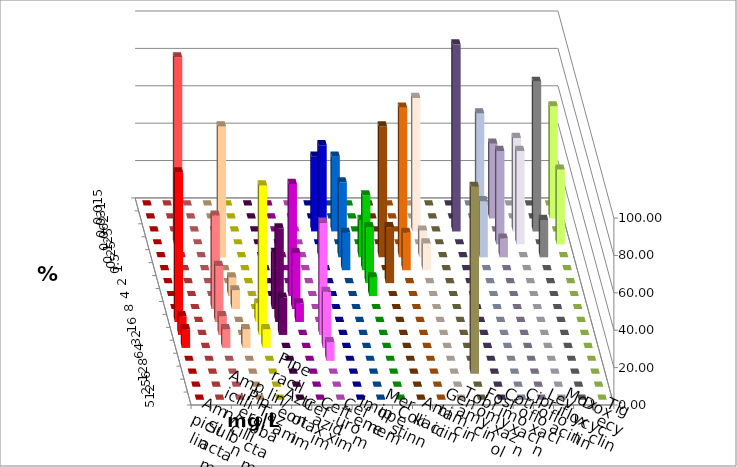
| Category | Ampicillin | Ampicillin/ Sulbactam | Piperacillin | Piperacillin/ Tazobactam | Aztreonam | Cefotaxim | Ceftazidim | Cefuroxim | Imipenem | Meropenem | Colistin | Amikacin | Gentamicin | Tobramycin | Fosfomycin | Cotrimoxazol | Ciprofloxacin | Levofloxacin | Moxifloxacin | Doxycyclin | Tigecyclin |
|---|---|---|---|---|---|---|---|---|---|---|---|---|---|---|---|---|---|---|---|---|---|
| 0.015 | 0 | 0 | 0 | 0 | 0 | 0 | 0 | 0 | 0 | 0 | 0 | 0 | 0 | 0 | 0 | 0 | 0 | 0 | 0 | 0 | 0 |
| 0.031 | 0 | 0 | 0 | 0 | 0 | 0 | 0 | 0 | 0 | 0 | 0 | 0 | 0 | 0 | 0 | 0 | 0 | 40 | 0 | 0 | 60 |
| 0.062 | 0 | 0 | 0 | 0 | 0 | 0 | 0 | 0 | 40 | 40 | 0 | 0 | 0 | 71.429 | 0 | 100 | 0 | 0 | 50 | 80 | 0 |
| 0.125 | 0 | 100 | 0 | 0 | 0 | 0 | 0 | 0 | 0 | 0 | 0 | 0 | 0 | 0 | 0 | 0 | 70 | 50 | 50 | 0 | 40 |
| 0.25 | 0 | 0 | 0 | 70 | 0 | 0 | 0 | 0 | 60 | 40 | 20 | 70 | 80 | 14.286 | 0 | 0 | 30 | 10 | 0 | 20 | 0 |
| 0.5 | 0 | 0 | 0 | 0 | 0 | 0 | 0 | 0 | 0 | 20 | 40 | 0 | 20 | 14.286 | 0 | 0 | 0 | 0 | 0 | 0 | 0 |
| 1.0 | 0 | 0 | 0 | 0 | 0 | 0 | 0 | 0 | 0 | 0 | 30 | 30 | 0 | 0 | 0 | 0 | 0 | 0 | 0 | 0 | 0 |
| 2.0 | 0 | 0 | 0 | 10 | 0 | 0 | 60 | 0 | 0 | 0 | 10 | 0 | 0 | 0 | 0 | 0 | 0 | 0 | 0 | 0 | 0 |
| 4.0 | 0 | 0 | 50 | 10 | 0 | 30 | 30 | 0 | 0 | 0 | 0 | 0 | 0 | 0 | 0 | 0 | 0 | 0 | 0 | 0 | 0 |
| 8.0 | 80 | 0 | 30 | 0 | 10 | 50 | 10 | 0 | 0 | 0 | 0 | 0 | 0 | 0 | 0 | 0 | 0 | 0 | 0 | 0 | 0 |
| 16.0 | 10 | 0 | 10 | 0 | 80 | 20 | 0 | 60 | 0 | 0 | 0 | 0 | 0 | 0 | 0 | 0 | 0 | 0 | 0 | 0 | 0 |
| 32.0 | 10 | 0 | 10 | 10 | 10 | 0 | 0 | 30 | 0 | 0 | 0 | 0 | 0 | 0 | 0 | 0 | 0 | 0 | 0 | 0 | 0 |
| 64.0 | 0 | 0 | 0 | 0 | 0 | 0 | 0 | 10 | 0 | 0 | 0 | 0 | 0 | 0 | 0 | 0 | 0 | 0 | 0 | 0 | 0 |
| 128.0 | 0 | 0 | 0 | 0 | 0 | 0 | 0 | 0 | 0 | 0 | 0 | 0 | 0 | 0 | 100 | 0 | 0 | 0 | 0 | 0 | 0 |
| 256.0 | 0 | 0 | 0 | 0 | 0 | 0 | 0 | 0 | 0 | 0 | 0 | 0 | 0 | 0 | 0 | 0 | 0 | 0 | 0 | 0 | 0 |
| 512.0 | 0 | 0 | 0 | 0 | 0 | 0 | 0 | 0 | 0 | 0 | 0 | 0 | 0 | 0 | 0 | 0 | 0 | 0 | 0 | 0 | 0 |